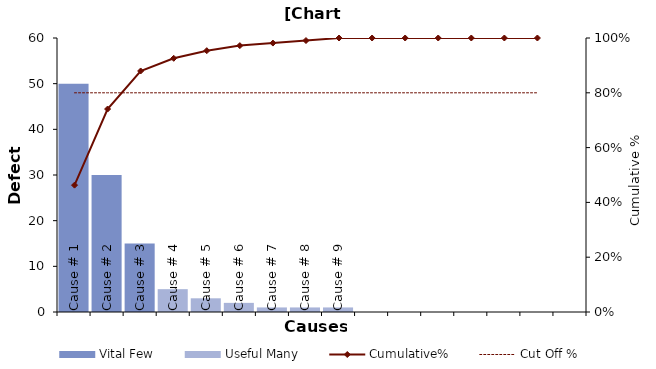
| Category | Vital Few | Useful Many | Labels |
|---|---|---|---|
| Cause # 1 | 50 | 0 | 0 |
| Cause # 2 | 30 | 0 | 0 |
| Cause # 3 | 15 | 0 | 0 |
| Cause # 4 | 0 | 5 | 0 |
| Cause # 5 | 0 | 3 | 0 |
| Cause # 6 | 0 | 2 | 0 |
| Cause # 7 | 0 | 1 | 0 |
| Cause # 8 | 0 | 1 | 0 |
| Cause # 9 | 0 | 1 | 0 |